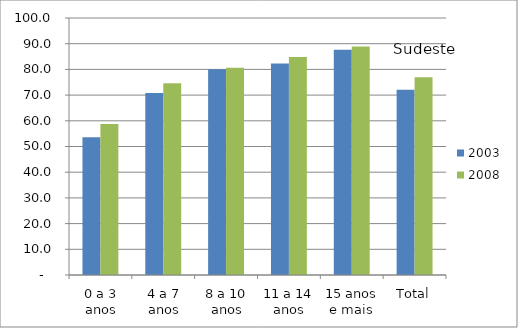
| Category | 2003 | 2008 |
|---|---|---|
| 0 a 3 anos | 53.64 | 58.74 |
| 4 a 7 anos | 70.81 | 74.64 |
| 8 a 10 anos | 80.04 | 80.61 |
| 11 a 14 anos | 82.25 | 84.87 |
| 15 anos e mais | 87.63 | 88.94 |
| Total | 72.11 | 76.95 |